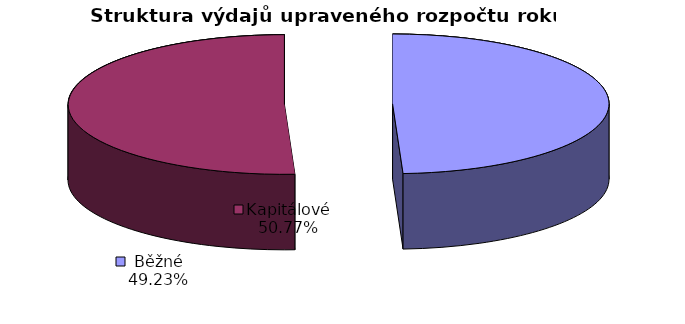
| Category | Upravený rozpočet |
|---|---|
| Běžné | 92121 |
| Kapitálové | 95008 |